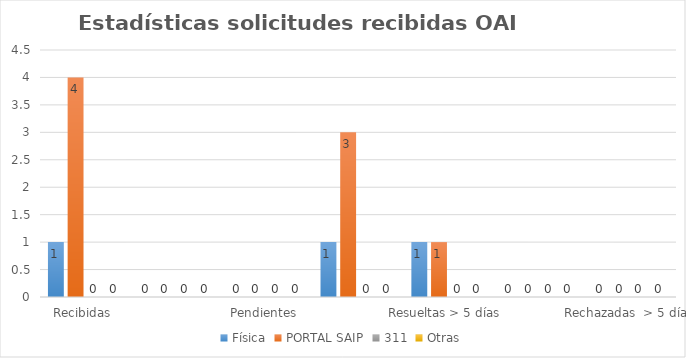
| Category | Física | PORTAL SAIP | 311 | Otras |
|---|---|---|---|---|
| Recibidas  | 1 | 4 | 0 | 0 |
| Cambiadas a otra institución | 0 | 0 | 0 | 0 |
| Pendientes  | 0 | 0 | 0 | 0 |
| Resueltas < 5 días | 1 | 3 | 0 | 0 |
| Resueltas > 5 días  | 1 | 1 | 0 | 0 |
| Rechazadas  < 5 días | 0 | 0 | 0 | 0 |
| Rechazadas  > 5 días | 0 | 0 | 0 | 0 |